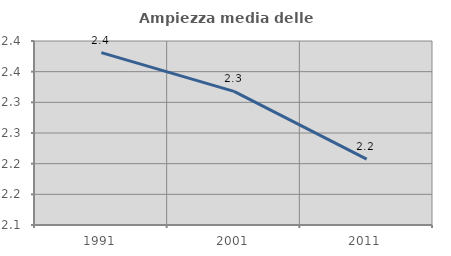
| Category | Ampiezza media delle famiglie |
|---|---|
| 1991.0 | 2.381 |
| 2001.0 | 2.318 |
| 2011.0 | 2.207 |